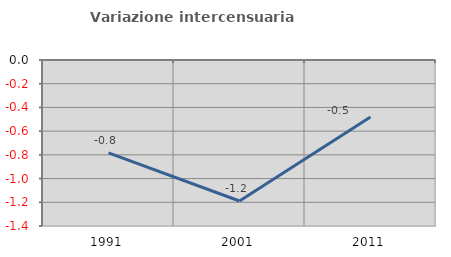
| Category | Variazione intercensuaria annua |
|---|---|
| 1991.0 | -0.784 |
| 2001.0 | -1.189 |
| 2011.0 | -0.482 |